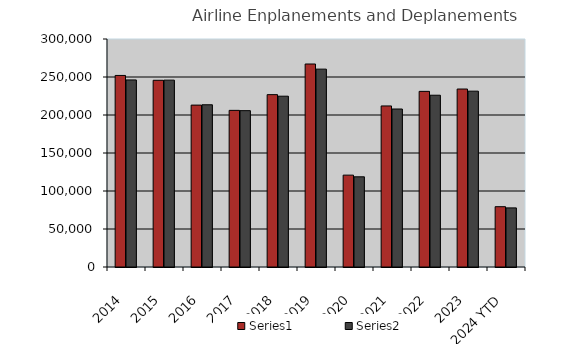
| Category | Series 0 | Series 1 |
|---|---|---|
| 2014 | 252052 | 246146 |
| 2015 | 245672 | 245880 |
| 2016 | 213024 | 213466 |
| 2017 | 206100 | 205718 |
| 2018 | 226803 | 224740 |
| 2019 | 267100 | 260360 |
| 2020 | 120877 | 118658 |
| 2021 | 211912 | 207884 |
| 2022 | 231095 | 226011 |
| 2023 | 234177 | 231353 |
| 2024 YTD | 79346 | 77756 |